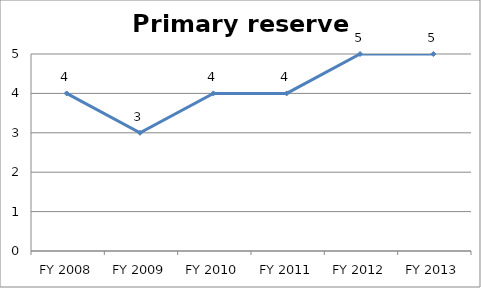
| Category | Primary reserve score |
|---|---|
| FY 2013 | 5 |
| FY 2012 | 5 |
| FY 2011 | 4 |
| FY 2010 | 4 |
| FY 2009 | 3 |
| FY 2008 | 4 |